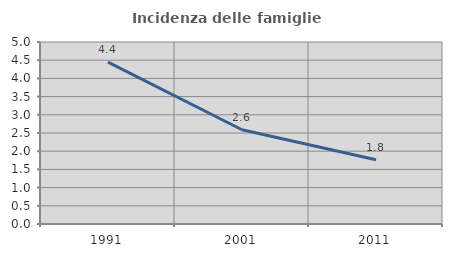
| Category | Incidenza delle famiglie numerose |
|---|---|
| 1991.0 | 4.448 |
| 2001.0 | 2.589 |
| 2011.0 | 1.766 |